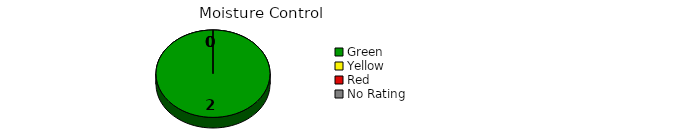
| Category | Counts |
|---|---|
| Green | 2 |
| Yellow | 0 |
| Red | 0 |
| No Rating | 0 |